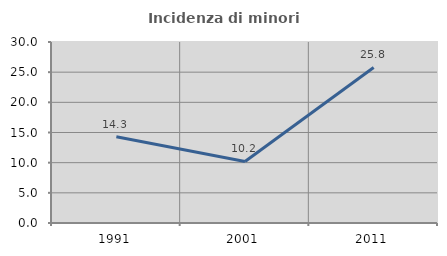
| Category | Incidenza di minori stranieri |
|---|---|
| 1991.0 | 14.286 |
| 2001.0 | 10.204 |
| 2011.0 | 25.781 |